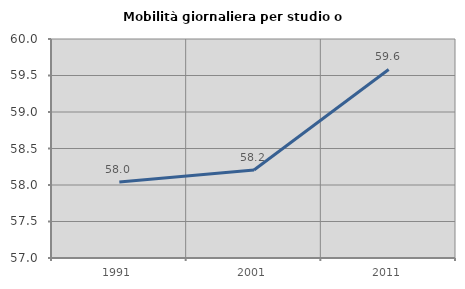
| Category | Mobilità giornaliera per studio o lavoro |
|---|---|
| 1991.0 | 58.042 |
| 2001.0 | 58.205 |
| 2011.0 | 59.583 |